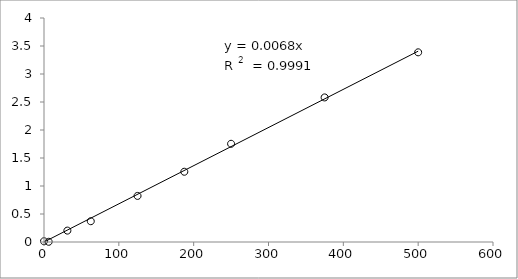
| Category | Series 0 |
|---|---|
| 500.0 | 3.387 |
| 375.0 | 2.582 |
| 250.0 | 1.754 |
| 187.5 | 1.255 |
| 125.0 | 0.823 |
| 62.5 | 0.371 |
| 31.25 | 0.204 |
| 6.25 | 0.004 |
| 0.0 | 0.014 |